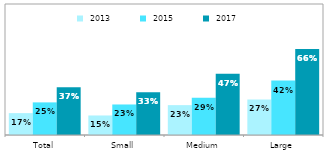
| Category |  2013 |  2015 |  2017 |
|---|---|---|---|
| Total | 0.167 | 0.249 | 0.365 |
| Small | 0.149 | 0.233 | 0.327 |
| Medium | 0.228 | 0.285 | 0.468 |
| Large | 0.271 | 0.416 | 0.656 |